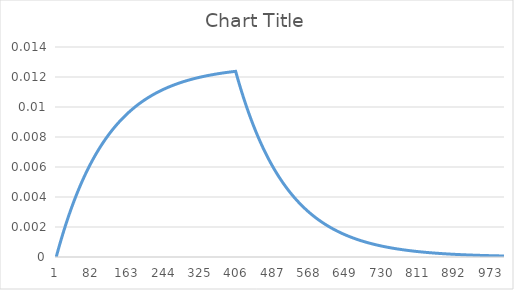
| Category | Series 0 |
|---|---|
| 0 | 0 |
| 1 | 0 |
| 2 | 0 |
| 3 | 0 |
| 4 | 0 |
| 5 | 0.001 |
| 6 | 0.001 |
| 7 | 0.001 |
| 8 | 0.001 |
| 9 | 0.001 |
| 10 | 0.001 |
| 11 | 0.001 |
| 12 | 0.001 |
| 13 | 0.001 |
| 14 | 0.001 |
| 15 | 0.002 |
| 16 | 0.002 |
| 17 | 0.002 |
| 18 | 0.002 |
| 19 | 0.002 |
| 20 | 0.002 |
| 21 | 0.002 |
| 22 | 0.002 |
| 23 | 0.002 |
| 24 | 0.002 |
| 25 | 0.002 |
| 26 | 0.003 |
| 27 | 0.003 |
| 28 | 0.003 |
| 29 | 0.003 |
| 30 | 0.003 |
| 31 | 0.003 |
| 32 | 0.003 |
| 33 | 0.003 |
| 34 | 0.003 |
| 35 | 0.003 |
| 36 | 0.003 |
| 37 | 0.004 |
| 38 | 0.004 |
| 39 | 0.004 |
| 40 | 0.004 |
| 41 | 0.004 |
| 42 | 0.004 |
| 43 | 0.004 |
| 44 | 0.004 |
| 45 | 0.004 |
| 46 | 0.004 |
| 47 | 0.004 |
| 48 | 0.004 |
| 49 | 0.004 |
| 50 | 0.005 |
| 51 | 0.005 |
| 52 | 0.005 |
| 53 | 0.005 |
| 54 | 0.005 |
| 55 | 0.005 |
| 56 | 0.005 |
| 57 | 0.005 |
| 58 | 0.005 |
| 59 | 0.005 |
| 60 | 0.005 |
| 61 | 0.005 |
| 62 | 0.005 |
| 63 | 0.005 |
| 64 | 0.005 |
| 65 | 0.006 |
| 66 | 0.006 |
| 67 | 0.006 |
| 68 | 0.006 |
| 69 | 0.006 |
| 70 | 0.006 |
| 71 | 0.006 |
| 72 | 0.006 |
| 73 | 0.006 |
| 74 | 0.006 |
| 75 | 0.006 |
| 76 | 0.006 |
| 77 | 0.006 |
| 78 | 0.006 |
| 79 | 0.006 |
| 80 | 0.006 |
| 81 | 0.006 |
| 82 | 0.007 |
| 83 | 0.007 |
| 84 | 0.007 |
| 85 | 0.007 |
| 86 | 0.007 |
| 87 | 0.007 |
| 88 | 0.007 |
| 89 | 0.007 |
| 90 | 0.007 |
| 91 | 0.007 |
| 92 | 0.007 |
| 93 | 0.007 |
| 94 | 0.007 |
| 95 | 0.007 |
| 96 | 0.007 |
| 97 | 0.007 |
| 98 | 0.007 |
| 99 | 0.007 |
| 100 | 0.007 |
| 101 | 0.007 |
| 102 | 0.008 |
| 103 | 0.008 |
| 104 | 0.008 |
| 105 | 0.008 |
| 106 | 0.008 |
| 107 | 0.008 |
| 108 | 0.008 |
| 109 | 0.008 |
| 110 | 0.008 |
| 111 | 0.008 |
| 112 | 0.008 |
| 113 | 0.008 |
| 114 | 0.008 |
| 115 | 0.008 |
| 116 | 0.008 |
| 117 | 0.008 |
| 118 | 0.008 |
| 119 | 0.008 |
| 120 | 0.008 |
| 121 | 0.008 |
| 122 | 0.008 |
| 123 | 0.008 |
| 124 | 0.008 |
| 125 | 0.008 |
| 126 | 0.009 |
| 127 | 0.009 |
| 128 | 0.009 |
| 129 | 0.009 |
| 130 | 0.009 |
| 131 | 0.009 |
| 132 | 0.009 |
| 133 | 0.009 |
| 134 | 0.009 |
| 135 | 0.009 |
| 136 | 0.009 |
| 137 | 0.009 |
| 138 | 0.009 |
| 139 | 0.009 |
| 140 | 0.009 |
| 141 | 0.009 |
| 142 | 0.009 |
| 143 | 0.009 |
| 144 | 0.009 |
| 145 | 0.009 |
| 146 | 0.009 |
| 147 | 0.009 |
| 148 | 0.009 |
| 149 | 0.009 |
| 150 | 0.009 |
| 151 | 0.009 |
| 152 | 0.009 |
| 153 | 0.009 |
| 154 | 0.009 |
| 155 | 0.009 |
| 156 | 0.009 |
| 157 | 0.01 |
| 158 | 0.01 |
| 159 | 0.01 |
| 160 | 0.01 |
| 161 | 0.01 |
| 162 | 0.01 |
| 163 | 0.01 |
| 164 | 0.01 |
| 165 | 0.01 |
| 166 | 0.01 |
| 167 | 0.01 |
| 168 | 0.01 |
| 169 | 0.01 |
| 170 | 0.01 |
| 171 | 0.01 |
| 172 | 0.01 |
| 173 | 0.01 |
| 174 | 0.01 |
| 175 | 0.01 |
| 176 | 0.01 |
| 177 | 0.01 |
| 178 | 0.01 |
| 179 | 0.01 |
| 180 | 0.01 |
| 181 | 0.01 |
| 182 | 0.01 |
| 183 | 0.01 |
| 184 | 0.01 |
| 185 | 0.01 |
| 186 | 0.01 |
| 187 | 0.01 |
| 188 | 0.01 |
| 189 | 0.01 |
| 190 | 0.01 |
| 191 | 0.01 |
| 192 | 0.01 |
| 193 | 0.01 |
| 194 | 0.01 |
| 195 | 0.01 |
| 196 | 0.01 |
| 197 | 0.01 |
| 198 | 0.01 |
| 199 | 0.011 |
| 200 | 0.011 |
| 201 | 0.011 |
| 202 | 0.011 |
| 203 | 0.011 |
| 204 | 0.011 |
| 205 | 0.011 |
| 206 | 0.011 |
| 207 | 0.011 |
| 208 | 0.011 |
| 209 | 0.011 |
| 210 | 0.011 |
| 211 | 0.011 |
| 212 | 0.011 |
| 213 | 0.011 |
| 214 | 0.011 |
| 215 | 0.011 |
| 216 | 0.011 |
| 217 | 0.011 |
| 218 | 0.011 |
| 219 | 0.011 |
| 220 | 0.011 |
| 221 | 0.011 |
| 222 | 0.011 |
| 223 | 0.011 |
| 224 | 0.011 |
| 225 | 0.011 |
| 226 | 0.011 |
| 227 | 0.011 |
| 228 | 0.011 |
| 229 | 0.011 |
| 230 | 0.011 |
| 231 | 0.011 |
| 232 | 0.011 |
| 233 | 0.011 |
| 234 | 0.011 |
| 235 | 0.011 |
| 236 | 0.011 |
| 237 | 0.011 |
| 238 | 0.011 |
| 239 | 0.011 |
| 240 | 0.011 |
| 241 | 0.011 |
| 242 | 0.011 |
| 243 | 0.011 |
| 244 | 0.011 |
| 245 | 0.011 |
| 246 | 0.011 |
| 247 | 0.011 |
| 248 | 0.011 |
| 249 | 0.011 |
| 250 | 0.011 |
| 251 | 0.011 |
| 252 | 0.011 |
| 253 | 0.011 |
| 254 | 0.011 |
| 255 | 0.011 |
| 256 | 0.011 |
| 257 | 0.011 |
| 258 | 0.011 |
| 259 | 0.011 |
| 260 | 0.011 |
| 261 | 0.011 |
| 262 | 0.011 |
| 263 | 0.011 |
| 264 | 0.011 |
| 265 | 0.011 |
| 266 | 0.012 |
| 267 | 0.012 |
| 268 | 0.012 |
| 269 | 0.012 |
| 270 | 0.012 |
| 271 | 0.012 |
| 272 | 0.012 |
| 273 | 0.012 |
| 274 | 0.012 |
| 275 | 0.012 |
| 276 | 0.012 |
| 277 | 0.012 |
| 278 | 0.012 |
| 279 | 0.012 |
| 280 | 0.012 |
| 281 | 0.012 |
| 282 | 0.012 |
| 283 | 0.012 |
| 284 | 0.012 |
| 285 | 0.012 |
| 286 | 0.012 |
| 287 | 0.012 |
| 288 | 0.012 |
| 289 | 0.012 |
| 290 | 0.012 |
| 291 | 0.012 |
| 292 | 0.012 |
| 293 | 0.012 |
| 294 | 0.012 |
| 295 | 0.012 |
| 296 | 0.012 |
| 297 | 0.012 |
| 298 | 0.012 |
| 299 | 0.012 |
| 300 | 0.012 |
| 301 | 0.012 |
| 302 | 0.012 |
| 303 | 0.012 |
| 304 | 0.012 |
| 305 | 0.012 |
| 306 | 0.012 |
| 307 | 0.012 |
| 308 | 0.012 |
| 309 | 0.012 |
| 310 | 0.012 |
| 311 | 0.012 |
| 312 | 0.012 |
| 313 | 0.012 |
| 314 | 0.012 |
| 315 | 0.012 |
| 316 | 0.012 |
| 317 | 0.012 |
| 318 | 0.012 |
| 319 | 0.012 |
| 320 | 0.012 |
| 321 | 0.012 |
| 322 | 0.012 |
| 323 | 0.012 |
| 324 | 0.012 |
| 325 | 0.012 |
| 326 | 0.012 |
| 327 | 0.012 |
| 328 | 0.012 |
| 329 | 0.012 |
| 330 | 0.012 |
| 331 | 0.012 |
| 332 | 0.012 |
| 333 | 0.012 |
| 334 | 0.012 |
| 335 | 0.012 |
| 336 | 0.012 |
| 337 | 0.012 |
| 338 | 0.012 |
| 339 | 0.012 |
| 340 | 0.012 |
| 341 | 0.012 |
| 342 | 0.012 |
| 343 | 0.012 |
| 344 | 0.012 |
| 345 | 0.012 |
| 346 | 0.012 |
| 347 | 0.012 |
| 348 | 0.012 |
| 349 | 0.012 |
| 350 | 0.012 |
| 351 | 0.012 |
| 352 | 0.012 |
| 353 | 0.012 |
| 354 | 0.012 |
| 355 | 0.012 |
| 356 | 0.012 |
| 357 | 0.012 |
| 358 | 0.012 |
| 359 | 0.012 |
| 360 | 0.012 |
| 361 | 0.012 |
| 362 | 0.012 |
| 363 | 0.012 |
| 364 | 0.012 |
| 365 | 0.012 |
| 366 | 0.012 |
| 367 | 0.012 |
| 368 | 0.012 |
| 369 | 0.012 |
| 370 | 0.012 |
| 371 | 0.012 |
| 372 | 0.012 |
| 373 | 0.012 |
| 374 | 0.012 |
| 375 | 0.012 |
| 376 | 0.012 |
| 377 | 0.012 |
| 378 | 0.012 |
| 379 | 0.012 |
| 380 | 0.012 |
| 381 | 0.012 |
| 382 | 0.012 |
| 383 | 0.012 |
| 384 | 0.012 |
| 385 | 0.012 |
| 386 | 0.012 |
| 387 | 0.012 |
| 388 | 0.012 |
| 389 | 0.012 |
| 390 | 0.012 |
| 391 | 0.012 |
| 392 | 0.012 |
| 393 | 0.012 |
| 394 | 0.012 |
| 395 | 0.012 |
| 396 | 0.012 |
| 397 | 0.012 |
| 398 | 0.012 |
| 399 | 0.012 |
| 400 | 0.012 |
| 401 | 0.012 |
| 402 | 0.012 |
| 403 | 0.012 |
| 404 | 0.012 |
| 405 | 0.012 |
| 406 | 0.012 |
| 407 | 0.012 |
| 408 | 0.012 |
| 409 | 0.011 |
| 410 | 0.011 |
| 411 | 0.011 |
| 412 | 0.011 |
| 413 | 0.011 |
| 414 | 0.011 |
| 415 | 0.011 |
| 416 | 0.011 |
| 417 | 0.011 |
| 418 | 0.011 |
| 419 | 0.01 |
| 420 | 0.01 |
| 421 | 0.01 |
| 422 | 0.01 |
| 423 | 0.01 |
| 424 | 0.01 |
| 425 | 0.01 |
| 426 | 0.01 |
| 427 | 0.01 |
| 428 | 0.01 |
| 429 | 0.01 |
| 430 | 0.01 |
| 431 | 0.009 |
| 432 | 0.009 |
| 433 | 0.009 |
| 434 | 0.009 |
| 435 | 0.009 |
| 436 | 0.009 |
| 437 | 0.009 |
| 438 | 0.009 |
| 439 | 0.009 |
| 440 | 0.009 |
| 441 | 0.009 |
| 442 | 0.009 |
| 443 | 0.009 |
| 444 | 0.008 |
| 445 | 0.008 |
| 446 | 0.008 |
| 447 | 0.008 |
| 448 | 0.008 |
| 449 | 0.008 |
| 450 | 0.008 |
| 451 | 0.008 |
| 452 | 0.008 |
| 453 | 0.008 |
| 454 | 0.008 |
| 455 | 0.008 |
| 456 | 0.008 |
| 457 | 0.008 |
| 458 | 0.007 |
| 459 | 0.007 |
| 460 | 0.007 |
| 461 | 0.007 |
| 462 | 0.007 |
| 463 | 0.007 |
| 464 | 0.007 |
| 465 | 0.007 |
| 466 | 0.007 |
| 467 | 0.007 |
| 468 | 0.007 |
| 469 | 0.007 |
| 470 | 0.007 |
| 471 | 0.007 |
| 472 | 0.007 |
| 473 | 0.007 |
| 474 | 0.007 |
| 475 | 0.006 |
| 476 | 0.006 |
| 477 | 0.006 |
| 478 | 0.006 |
| 479 | 0.006 |
| 480 | 0.006 |
| 481 | 0.006 |
| 482 | 0.006 |
| 483 | 0.006 |
| 484 | 0.006 |
| 485 | 0.006 |
| 486 | 0.006 |
| 487 | 0.006 |
| 488 | 0.006 |
| 489 | 0.006 |
| 490 | 0.006 |
| 491 | 0.006 |
| 492 | 0.006 |
| 493 | 0.006 |
| 494 | 0.005 |
| 495 | 0.005 |
| 496 | 0.005 |
| 497 | 0.005 |
| 498 | 0.005 |
| 499 | 0.005 |
| 500 | 0.005 |
| 501 | 0.005 |
| 502 | 0.005 |
| 503 | 0.005 |
| 504 | 0.005 |
| 505 | 0.005 |
| 506 | 0.005 |
| 507 | 0.005 |
| 508 | 0.005 |
| 509 | 0.005 |
| 510 | 0.005 |
| 511 | 0.005 |
| 512 | 0.005 |
| 513 | 0.005 |
| 514 | 0.005 |
| 515 | 0.005 |
| 516 | 0.005 |
| 517 | 0.004 |
| 518 | 0.004 |
| 519 | 0.004 |
| 520 | 0.004 |
| 521 | 0.004 |
| 522 | 0.004 |
| 523 | 0.004 |
| 524 | 0.004 |
| 525 | 0.004 |
| 526 | 0.004 |
| 527 | 0.004 |
| 528 | 0.004 |
| 529 | 0.004 |
| 530 | 0.004 |
| 531 | 0.004 |
| 532 | 0.004 |
| 533 | 0.004 |
| 534 | 0.004 |
| 535 | 0.004 |
| 536 | 0.004 |
| 537 | 0.004 |
| 538 | 0.004 |
| 539 | 0.004 |
| 540 | 0.004 |
| 541 | 0.004 |
| 542 | 0.004 |
| 543 | 0.004 |
| 544 | 0.004 |
| 545 | 0.004 |
| 546 | 0.003 |
| 547 | 0.003 |
| 548 | 0.003 |
| 549 | 0.003 |
| 550 | 0.003 |
| 551 | 0.003 |
| 552 | 0.003 |
| 553 | 0.003 |
| 554 | 0.003 |
| 555 | 0.003 |
| 556 | 0.003 |
| 557 | 0.003 |
| 558 | 0.003 |
| 559 | 0.003 |
| 560 | 0.003 |
| 561 | 0.003 |
| 562 | 0.003 |
| 563 | 0.003 |
| 564 | 0.003 |
| 565 | 0.003 |
| 566 | 0.003 |
| 567 | 0.003 |
| 568 | 0.003 |
| 569 | 0.003 |
| 570 | 0.003 |
| 571 | 0.003 |
| 572 | 0.003 |
| 573 | 0.003 |
| 574 | 0.003 |
| 575 | 0.003 |
| 576 | 0.003 |
| 577 | 0.003 |
| 578 | 0.003 |
| 579 | 0.003 |
| 580 | 0.003 |
| 581 | 0.003 |
| 582 | 0.003 |
| 583 | 0.003 |
| 584 | 0.002 |
| 585 | 0.002 |
| 586 | 0.002 |
| 587 | 0.002 |
| 588 | 0.002 |
| 589 | 0.002 |
| 590 | 0.002 |
| 591 | 0.002 |
| 592 | 0.002 |
| 593 | 0.002 |
| 594 | 0.002 |
| 595 | 0.002 |
| 596 | 0.002 |
| 597 | 0.002 |
| 598 | 0.002 |
| 599 | 0.002 |
| 600 | 0.002 |
| 601 | 0.002 |
| 602 | 0.002 |
| 603 | 0.002 |
| 604 | 0.002 |
| 605 | 0.002 |
| 606 | 0.002 |
| 607 | 0.002 |
| 608 | 0.002 |
| 609 | 0.002 |
| 610 | 0.002 |
| 611 | 0.002 |
| 612 | 0.002 |
| 613 | 0.002 |
| 614 | 0.002 |
| 615 | 0.002 |
| 616 | 0.002 |
| 617 | 0.002 |
| 618 | 0.002 |
| 619 | 0.002 |
| 620 | 0.002 |
| 621 | 0.002 |
| 622 | 0.002 |
| 623 | 0.002 |
| 624 | 0.002 |
| 625 | 0.002 |
| 626 | 0.002 |
| 627 | 0.002 |
| 628 | 0.002 |
| 629 | 0.002 |
| 630 | 0.002 |
| 631 | 0.002 |
| 632 | 0.002 |
| 633 | 0.002 |
| 634 | 0.002 |
| 635 | 0.002 |
| 636 | 0.002 |
| 637 | 0.002 |
| 638 | 0.002 |
| 639 | 0.002 |
| 640 | 0.002 |
| 641 | 0.002 |
| 642 | 0.002 |
| 643 | 0.001 |
| 644 | 0.001 |
| 645 | 0.001 |
| 646 | 0.001 |
| 647 | 0.001 |
| 648 | 0.001 |
| 649 | 0.001 |
| 650 | 0.001 |
| 651 | 0.001 |
| 652 | 0.001 |
| 653 | 0.001 |
| 654 | 0.001 |
| 655 | 0.001 |
| 656 | 0.001 |
| 657 | 0.001 |
| 658 | 0.001 |
| 659 | 0.001 |
| 660 | 0.001 |
| 661 | 0.001 |
| 662 | 0.001 |
| 663 | 0.001 |
| 664 | 0.001 |
| 665 | 0.001 |
| 666 | 0.001 |
| 667 | 0.001 |
| 668 | 0.001 |
| 669 | 0.001 |
| 670 | 0.001 |
| 671 | 0.001 |
| 672 | 0.001 |
| 673 | 0.001 |
| 674 | 0.001 |
| 675 | 0.001 |
| 676 | 0.001 |
| 677 | 0.001 |
| 678 | 0.001 |
| 679 | 0.001 |
| 680 | 0.001 |
| 681 | 0.001 |
| 682 | 0.001 |
| 683 | 0.001 |
| 684 | 0.001 |
| 685 | 0.001 |
| 686 | 0.001 |
| 687 | 0.001 |
| 688 | 0.001 |
| 689 | 0.001 |
| 690 | 0.001 |
| 691 | 0.001 |
| 692 | 0.001 |
| 693 | 0.001 |
| 694 | 0.001 |
| 695 | 0.001 |
| 696 | 0.001 |
| 697 | 0.001 |
| 698 | 0.001 |
| 699 | 0.001 |
| 700 | 0.001 |
| 701 | 0.001 |
| 702 | 0.001 |
| 703 | 0.001 |
| 704 | 0.001 |
| 705 | 0.001 |
| 706 | 0.001 |
| 707 | 0.001 |
| 708 | 0.001 |
| 709 | 0.001 |
| 710 | 0.001 |
| 711 | 0.001 |
| 712 | 0.001 |
| 713 | 0.001 |
| 714 | 0.001 |
| 715 | 0.001 |
| 716 | 0.001 |
| 717 | 0.001 |
| 718 | 0.001 |
| 719 | 0.001 |
| 720 | 0.001 |
| 721 | 0.001 |
| 722 | 0.001 |
| 723 | 0.001 |
| 724 | 0.001 |
| 725 | 0.001 |
| 726 | 0.001 |
| 727 | 0.001 |
| 728 | 0.001 |
| 729 | 0.001 |
| 730 | 0.001 |
| 731 | 0.001 |
| 732 | 0.001 |
| 733 | 0.001 |
| 734 | 0.001 |
| 735 | 0.001 |
| 736 | 0.001 |
| 737 | 0.001 |
| 738 | 0.001 |
| 739 | 0.001 |
| 740 | 0.001 |
| 741 | 0.001 |
| 742 | 0.001 |
| 743 | 0.001 |
| 744 | 0.001 |
| 745 | 0.001 |
| 746 | 0.001 |
| 747 | 0.001 |
| 748 | 0.001 |
| 749 | 0.001 |
| 750 | 0.001 |
| 751 | 0.001 |
| 752 | 0.001 |
| 753 | 0.001 |
| 754 | 0.001 |
| 755 | 0.001 |
| 756 | 0.001 |
| 757 | 0.001 |
| 758 | 0.001 |
| 759 | 0.001 |
| 760 | 0.001 |
| 761 | 0.001 |
| 762 | 0.001 |
| 763 | 0.001 |
| 764 | 0.001 |
| 765 | 0.001 |
| 766 | 0.001 |
| 767 | 0.001 |
| 768 | 0.001 |
| 769 | 0 |
| 770 | 0 |
| 771 | 0 |
| 772 | 0 |
| 773 | 0 |
| 774 | 0 |
| 775 | 0 |
| 776 | 0 |
| 777 | 0 |
| 778 | 0 |
| 779 | 0 |
| 780 | 0 |
| 781 | 0 |
| 782 | 0 |
| 783 | 0 |
| 784 | 0 |
| 785 | 0 |
| 786 | 0 |
| 787 | 0 |
| 788 | 0 |
| 789 | 0 |
| 790 | 0 |
| 791 | 0 |
| 792 | 0 |
| 793 | 0 |
| 794 | 0 |
| 795 | 0 |
| 796 | 0 |
| 797 | 0 |
| 798 | 0 |
| 799 | 0 |
| 800 | 0 |
| 801 | 0 |
| 802 | 0 |
| 803 | 0 |
| 804 | 0 |
| 805 | 0 |
| 806 | 0 |
| 807 | 0 |
| 808 | 0 |
| 809 | 0 |
| 810 | 0 |
| 811 | 0 |
| 812 | 0 |
| 813 | 0 |
| 814 | 0 |
| 815 | 0 |
| 816 | 0 |
| 817 | 0 |
| 818 | 0 |
| 819 | 0 |
| 820 | 0 |
| 821 | 0 |
| 822 | 0 |
| 823 | 0 |
| 824 | 0 |
| 825 | 0 |
| 826 | 0 |
| 827 | 0 |
| 828 | 0 |
| 829 | 0 |
| 830 | 0 |
| 831 | 0 |
| 832 | 0 |
| 833 | 0 |
| 834 | 0 |
| 835 | 0 |
| 836 | 0 |
| 837 | 0 |
| 838 | 0 |
| 839 | 0 |
| 840 | 0 |
| 841 | 0 |
| 842 | 0 |
| 843 | 0 |
| 844 | 0 |
| 845 | 0 |
| 846 | 0 |
| 847 | 0 |
| 848 | 0 |
| 849 | 0 |
| 850 | 0 |
| 851 | 0 |
| 852 | 0 |
| 853 | 0 |
| 854 | 0 |
| 855 | 0 |
| 856 | 0 |
| 857 | 0 |
| 858 | 0 |
| 859 | 0 |
| 860 | 0 |
| 861 | 0 |
| 862 | 0 |
| 863 | 0 |
| 864 | 0 |
| 865 | 0 |
| 866 | 0 |
| 867 | 0 |
| 868 | 0 |
| 869 | 0 |
| 870 | 0 |
| 871 | 0 |
| 872 | 0 |
| 873 | 0 |
| 874 | 0 |
| 875 | 0 |
| 876 | 0 |
| 877 | 0 |
| 878 | 0 |
| 879 | 0 |
| 880 | 0 |
| 881 | 0 |
| 882 | 0 |
| 883 | 0 |
| 884 | 0 |
| 885 | 0 |
| 886 | 0 |
| 887 | 0 |
| 888 | 0 |
| 889 | 0 |
| 890 | 0 |
| 891 | 0 |
| 892 | 0 |
| 893 | 0 |
| 894 | 0 |
| 895 | 0 |
| 896 | 0 |
| 897 | 0 |
| 898 | 0 |
| 899 | 0 |
| 900 | 0 |
| 901 | 0 |
| 902 | 0 |
| 903 | 0 |
| 904 | 0 |
| 905 | 0 |
| 906 | 0 |
| 907 | 0 |
| 908 | 0 |
| 909 | 0 |
| 910 | 0 |
| 911 | 0 |
| 912 | 0 |
| 913 | 0 |
| 914 | 0 |
| 915 | 0 |
| 916 | 0 |
| 917 | 0 |
| 918 | 0 |
| 919 | 0 |
| 920 | 0 |
| 921 | 0 |
| 922 | 0 |
| 923 | 0 |
| 924 | 0 |
| 925 | 0 |
| 926 | 0 |
| 927 | 0 |
| 928 | 0 |
| 929 | 0 |
| 930 | 0 |
| 931 | 0 |
| 932 | 0 |
| 933 | 0 |
| 934 | 0 |
| 935 | 0 |
| 936 | 0 |
| 937 | 0 |
| 938 | 0 |
| 939 | 0 |
| 940 | 0 |
| 941 | 0 |
| 942 | 0 |
| 943 | 0 |
| 944 | 0 |
| 945 | 0 |
| 946 | 0 |
| 947 | 0 |
| 948 | 0 |
| 949 | 0 |
| 950 | 0 |
| 951 | 0 |
| 952 | 0 |
| 953 | 0 |
| 954 | 0 |
| 955 | 0 |
| 956 | 0 |
| 957 | 0 |
| 958 | 0 |
| 959 | 0 |
| 960 | 0 |
| 961 | 0 |
| 962 | 0 |
| 963 | 0 |
| 964 | 0 |
| 965 | 0 |
| 966 | 0 |
| 967 | 0 |
| 968 | 0 |
| 969 | 0 |
| 970 | 0 |
| 971 | 0 |
| 972 | 0 |
| 973 | 0 |
| 974 | 0 |
| 975 | 0 |
| 976 | 0 |
| 977 | 0 |
| 978 | 0 |
| 979 | 0 |
| 980 | 0 |
| 981 | 0 |
| 982 | 0 |
| 983 | 0 |
| 984 | 0 |
| 985 | 0 |
| 986 | 0 |
| 987 | 0 |
| 988 | 0 |
| 989 | 0 |
| 990 | 0 |
| 991 | 0 |
| 992 | 0 |
| 993 | 0 |
| 994 | 0 |
| 995 | 0 |
| 996 | 0 |
| 997 | 0 |
| 998 | 0 |
| 999 | 0 |
| 1000 | 0 |